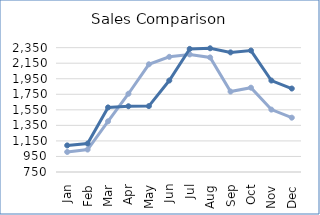
| Category | Sold 19 | Sold 20 |
|---|---|---|
| Jan | 1008 | 1092 |
| Feb | 1039 | 1116 |
| Mar | 1402 | 1581 |
| Apr | 1757 | 1596 |
| May | 2136 | 1598 |
| Jun | 2232 | 1927 |
| Jul | 2263 | 2334 |
| Aug | 2224 | 2342 |
| Sep | 1785 | 2289 |
| Oct | 1835 | 2313 |
| Nov | 1553 | 1927 |
| Dec | 1449 | 1824 |